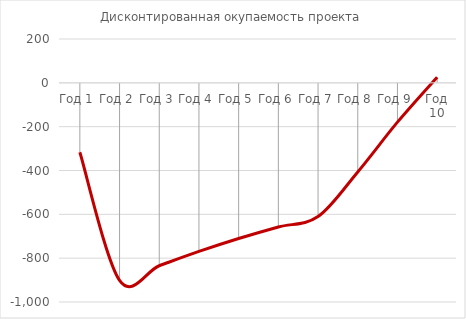
| Category | Дисконтированная окупаемость проекта |
|---|---|
| Год 1 | -316.8 |
| Год 2 | -901.167 |
| Год 3 | -834.504 |
| Год 4 | -769.251 |
| Год 5 | -710.384 |
| Год 6 | -657.614 |
| Год 7 | -610.316 |
| Год 8 | -406.466 |
| Год 9 | -179.424 |
| Год 10 | 25.75 |